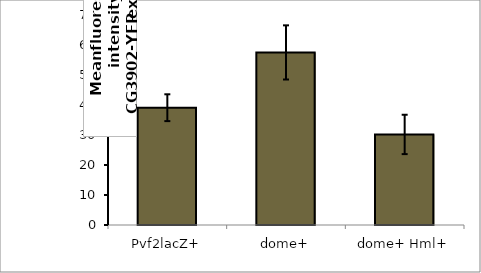
| Category | Series 0 |
|---|---|
| Pvf2lacZ+ | 39.099 |
| dome+ | 57.526 |
| dome+ Hml+ | 30.189 |